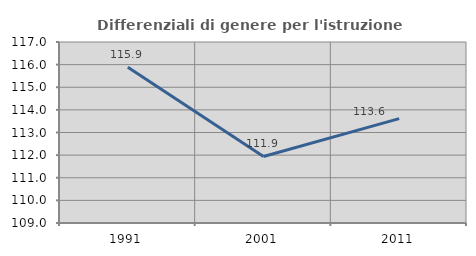
| Category | Differenziali di genere per l'istruzione superiore |
|---|---|
| 1991.0 | 115.88 |
| 2001.0 | 111.942 |
| 2011.0 | 113.613 |